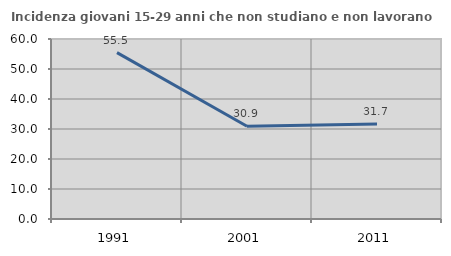
| Category | Incidenza giovani 15-29 anni che non studiano e non lavorano  |
|---|---|
| 1991.0 | 55.465 |
| 2001.0 | 30.92 |
| 2011.0 | 31.683 |